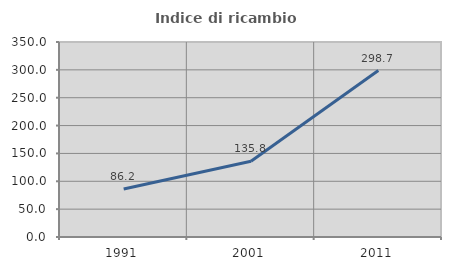
| Category | Indice di ricambio occupazionale  |
|---|---|
| 1991.0 | 86.207 |
| 2001.0 | 135.805 |
| 2011.0 | 298.746 |